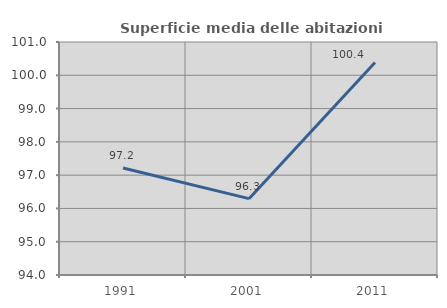
| Category | Superficie media delle abitazioni occupate |
|---|---|
| 1991.0 | 97.216 |
| 2001.0 | 96.294 |
| 2011.0 | 100.385 |